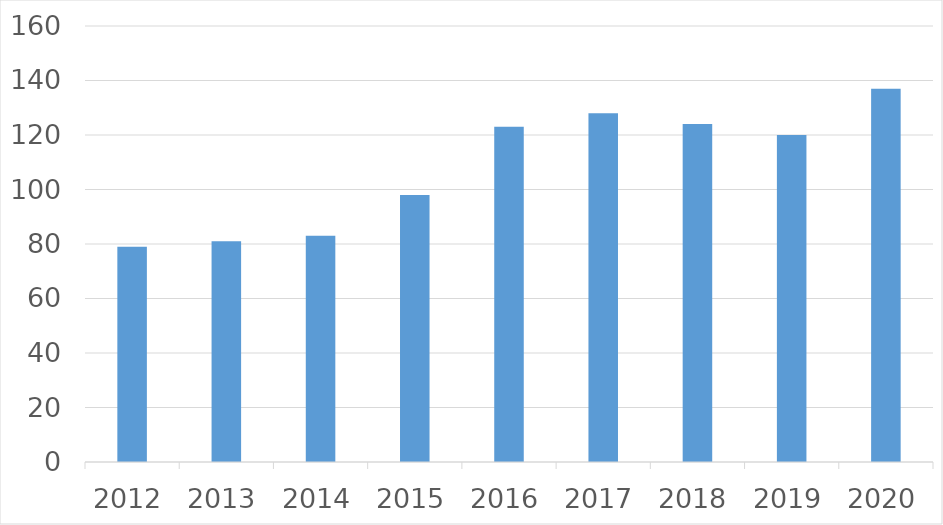
| Category | Series 0 |
|---|---|
| 2012 | 79 |
| 2013 | 81 |
| 2014 | 83 |
| 2015 | 98 |
| 2016 | 123 |
| 2017 | 128 |
| 2018 | 124 |
| 2019 | 120 |
| 2020 | 137 |